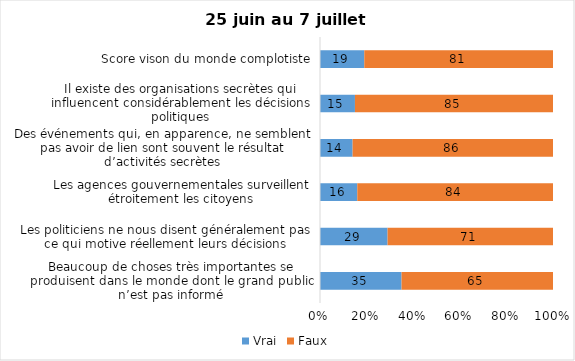
| Category | Vrai | Faux |
|---|---|---|
| Beaucoup de choses très importantes se produisent dans le monde dont le grand public n’est pas informé | 35 | 65 |
| Les politiciens ne nous disent généralement pas ce qui motive réellement leurs décisions | 29 | 71 |
| Les agences gouvernementales surveillent étroitement les citoyens | 16 | 84 |
| Des événements qui, en apparence, ne semblent pas avoir de lien sont souvent le résultat d’activités secrètes | 14 | 86 |
| Il existe des organisations secrètes qui influencent considérablement les décisions politiques | 15 | 85 |
| Score vison du monde complotiste | 19 | 81 |